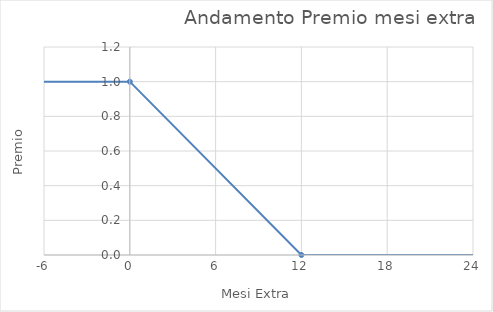
| Category | Series 0 |
|---|---|
| -24.0 | 1 |
| 0.0 | 1 |
| 12.0 | 0 |
| 150.0 | 0 |